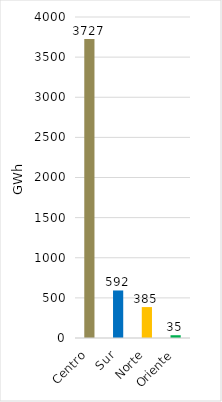
| Category | Series 0 |
|---|---|
| Centro | 3727.211 |
| Sur | 592.264 |
| Norte | 385.293 |
| Oriente | 34.553 |